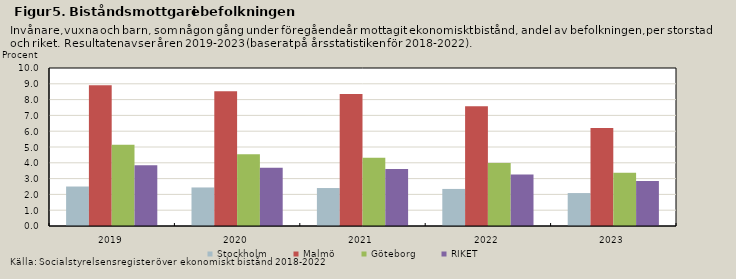
| Category | Stockholm | Malmö | Göteborg | RIKET |
|---|---|---|---|---|
| 2019.0 | 2.499 | 8.91 | 5.149 | 3.848 |
| 2020.0 | 2.439 | 8.524 | 4.547 | 3.691 |
| 2021.0 | 2.403 | 8.358 | 4.322 | 3.604 |
| 2022.0 | 2.346 | 7.585 | 3.995 | 3.258 |
| 2023.0 | 2.085 | 6.195 | 3.375 | 2.848 |